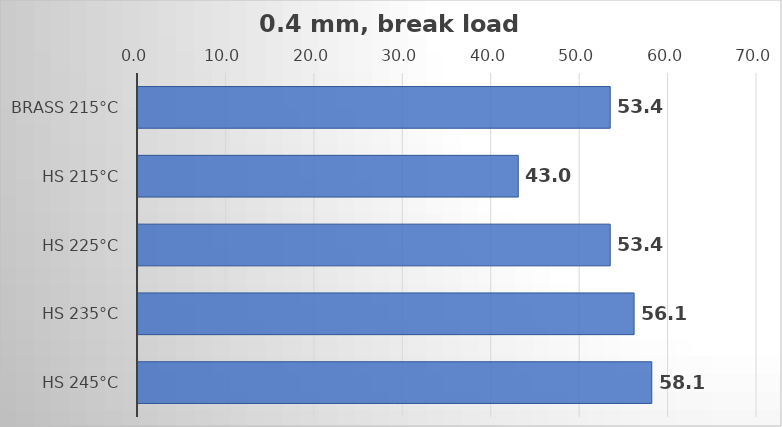
| Category | Average |
|---|---|
| Brass 215°C | 53.4 |
| HS 215°C | 43 |
| HS 225°C | 53.4 |
| HS 235°C | 56.1 |
| HS 245°C | 58.1 |